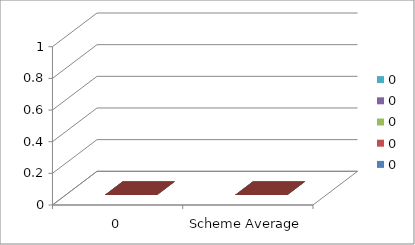
| Category | 0 |
|---|---|
| 0 | 0 |
| Scheme Average | 0 |